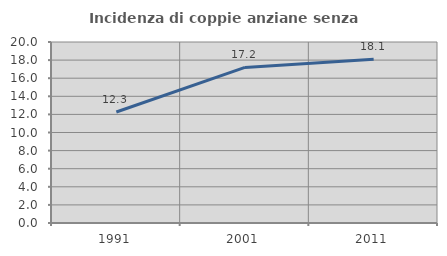
| Category | Incidenza di coppie anziane senza figli  |
|---|---|
| 1991.0 | 12.264 |
| 2001.0 | 17.195 |
| 2011.0 | 18.1 |